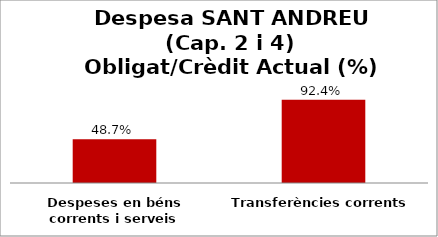
| Category | Series 0 |
|---|---|
| Despeses en béns corrents i serveis | 0.487 |
| Transferències corrents | 0.924 |